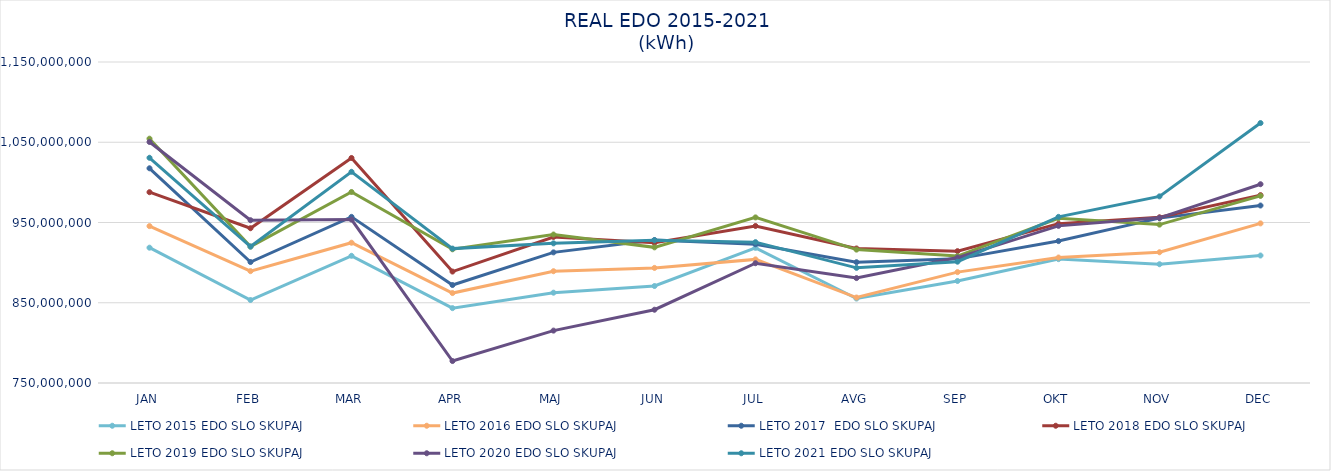
| Category | Series 0 | Series 1 | Series 2 | Series 3 | Series 4 | LETO 2005 | LETO 2006 | LETO 2007 | LETO 2008 | LETO 2009 | LETO 2010 | LETO 2011 | LETO 2012 | LETO 2013 | LETO 2014 | LETA 2005-2014 | LETO 2015 | LETO 2016 | LETO 2017  | LETO 2018 | LETO 2019 | LETO 2020 | LETO 2021 |
|---|---|---|---|---|---|---|---|---|---|---|---|---|---|---|---|---|---|---|---|---|---|---|---|
| JAN |  |  |  |  |  |  |  |  |  |  |  |  |  |  |  |  | 918616022 | 945505670 | 1017554541 | 987758244 | 1054447544 | 1050334322 | 1030659720 |
| FEB |  |  |  |  |  |  |  |  |  |  |  |  |  |  |  |  | 853419967 | 889407264 | 900754354 | 942855661 | 919998995 | 952858343 | 920015098 |
| MAR |  |  |  |  |  |  |  |  |  |  |  |  |  |  |  |  | 908505567 | 924806823 | 957011958 | 1030397250 | 988023480 | 953659228 | 1013180468 |
| APR |  |  |  |  |  |  |  |  |  |  |  |  |  |  |  |  | 843289811 | 862080230 | 872095806 | 888856618 | 916615983 | 777356326 | 917462865 |
| MAJ |  |  |  |  |  |  |  |  |  |  |  |  |  |  |  |  | 862547487 | 889290636 | 912765407 | 931981665 | 935011631 | 815292902 | 924014163 |
| JUN |  |  |  |  |  |  |  |  |  |  |  |  |  |  |  |  | 870854025 | 893415147 | 928192096 | 924642121 | 919029462 | 841308246 | 927803032 |
| JUL |  |  |  |  |  |  |  |  |  |  |  |  |  |  |  |  | 918422419 | 904027757 | 922901871 | 945674336 | 956349572 | 899259274 | 925511549 |
| AVG |  |  |  |  |  |  |  |  |  |  |  |  |  |  |  |  | 855241861 | 856497930 | 900503971 | 917631187 | 916231581 | 880753445 | 893511471 |
| SEP |  |  |  |  |  |  |  |  |  |  |  |  |  |  |  |  | 877109999 | 888171662 | 904683314 | 914312062 | 908194163 | 906310323 | 901158224 |
| OKT |  |  |  |  |  |  |  |  |  |  |  |  |  |  |  |  | 904367751 | 906358702 | 926846771 | 948608140 | 955327359 | 945812542 | 957019264 |
| NOV |  |  |  |  |  |  |  |  |  |  |  |  |  |  |  |  | 897996723 | 912928255 | 955466076 | 956484454 | 947378925 | 955852673 | 982577786 |
| DEC |  |  |  |  |  |  |  |  |  |  |  |  |  |  |  |  | 908867244 | 948885138 | 971164084 | 984132341 | 983124423 | 997713348 | 1073923789 |